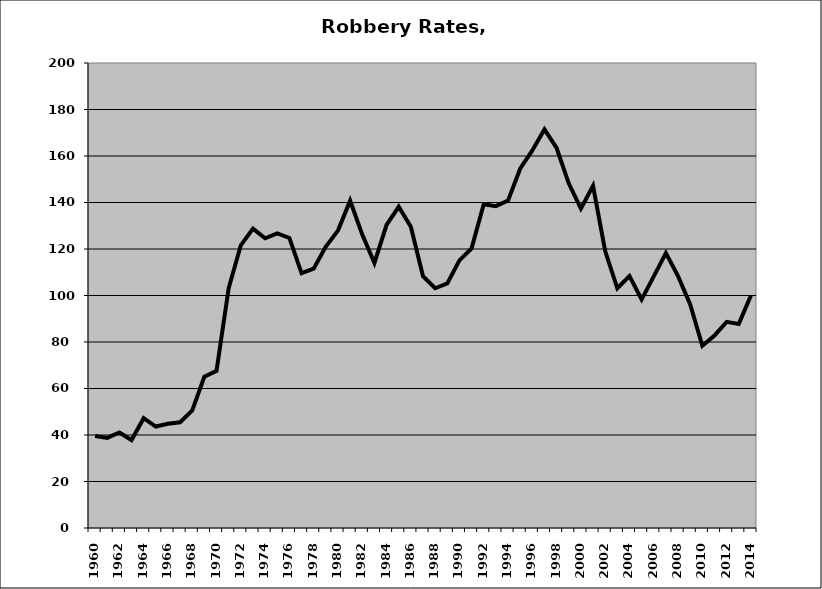
| Category | Robbery |
|---|---|
| 1960.0 | 39.536 |
| 1961.0 | 38.759 |
| 1962.0 | 41.078 |
| 1963.0 | 37.819 |
| 1964.0 | 47.222 |
| 1965.0 | 43.635 |
| 1966.0 | 44.814 |
| 1967.0 | 45.464 |
| 1968.0 | 50.542 |
| 1969.0 | 65.091 |
| 1970.0 | 67.618 |
| 1971.0 | 103.107 |
| 1972.0 | 121.596 |
| 1973.0 | 128.752 |
| 1974.0 | 124.599 |
| 1975.0 | 126.678 |
| 1976.0 | 124.743 |
| 1977.0 | 109.58 |
| 1978.0 | 111.551 |
| 1979.0 | 121.031 |
| 1980.0 | 127.907 |
| 1981.0 | 140.769 |
| 1982.0 | 126.196 |
| 1983.0 | 114.01 |
| 1984.0 | 130.337 |
| 1985.0 | 138.138 |
| 1986.0 | 129.547 |
| 1987.0 | 108.333 |
| 1988.0 | 103.113 |
| 1989.0 | 105.17 |
| 1990.0 | 115.11 |
| 1991.0 | 120.284 |
| 1992.0 | 139.279 |
| 1993.0 | 138.428 |
| 1994.0 | 140.81 |
| 1995.0 | 154.54 |
| 1996.0 | 162.405 |
| 1997.0 | 171.445 |
| 1998.0 | 163.443 |
| 1999.0 | 148.232 |
| 2000.0 | 137.38 |
| 2001.0 | 147.193 |
| 2002.0 | 119.112 |
| 2003.0 | 103.111 |
| 2004.0 | 108.355 |
| 2005.0 | 98.287 |
| 2006.0 | 108.206 |
| 2007.0 | 118.279 |
| 2008.0 | 108.317 |
| 2009.0 | 96.135 |
| 2010.0 | 78.381 |
| 2011.0 | 82.745 |
| 2012.0 | 88.647 |
| 2013.0 | 87.786 |
| 2014.0 | 100.021 |